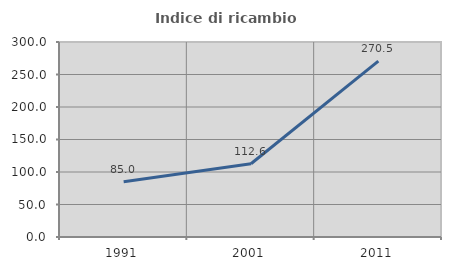
| Category | Indice di ricambio occupazionale  |
|---|---|
| 1991.0 | 84.958 |
| 2001.0 | 112.628 |
| 2011.0 | 270.52 |